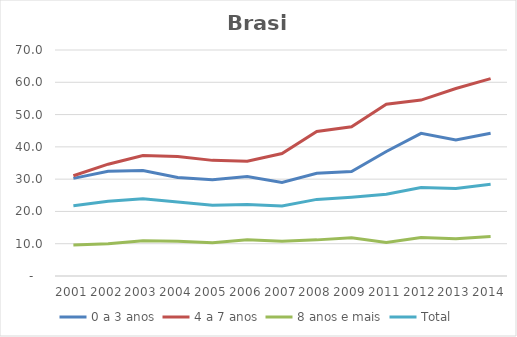
| Category | 0 a 3 anos | 4 a 7 anos | 8 anos e mais | Total |
|---|---|---|---|---|
| 2001.0 | 30.244 | 31.047 | 9.629 | 21.755 |
| 2002.0 | 32.424 | 34.636 | 9.957 | 23.152 |
| 2003.0 | 32.666 | 37.335 | 10.897 | 23.919 |
| 2004.0 | 30.54 | 37.041 | 10.74 | 22.916 |
| 2005.0 | 29.82 | 35.815 | 10.291 | 21.917 |
| 2006.0 | 30.783 | 35.563 | 11.251 | 22.135 |
| 2007.0 | 28.979 | 37.925 | 10.787 | 21.692 |
| 2008.0 | 31.809 | 44.75 | 11.19 | 23.732 |
| 2009.0 | 32.333 | 46.223 | 11.875 | 24.423 |
| 2011.0 | 38.565 | 53.189 | 10.41 | 25.342 |
| 2012.0 | 44.168 | 54.479 | 11.893 | 27.424 |
| 2013.0 | 42.108 | 58.061 | 11.552 | 27.119 |
| 2014.0 | 44.191 | 61.152 | 12.205 | 28.409 |